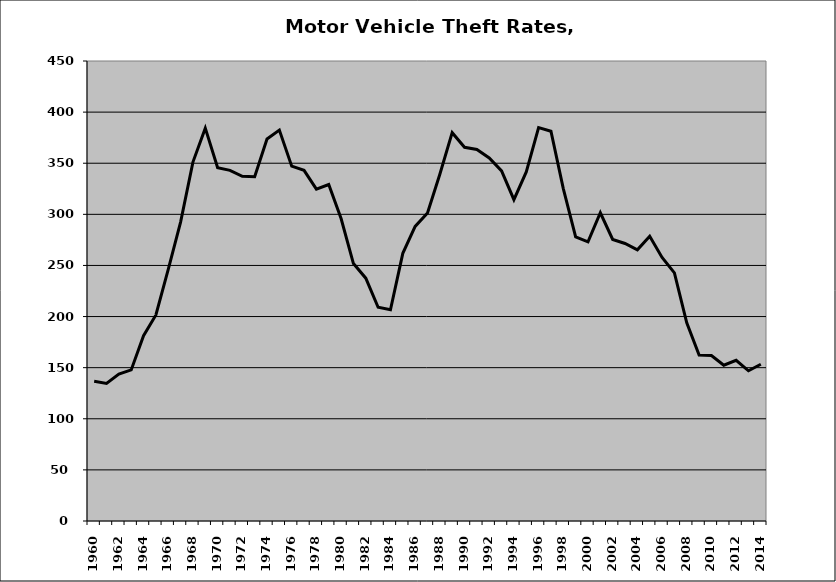
| Category | Motor Vehicle |
|---|---|
| 1960.0 | 136.678 |
| 1961.0 | 134.553 |
| 1962.0 | 143.741 |
| 1963.0 | 147.829 |
| 1964.0 | 181.312 |
| 1965.0 | 201.604 |
| 1966.0 | 246.253 |
| 1967.0 | 292.379 |
| 1968.0 | 351.097 |
| 1969.0 | 384.324 |
| 1970.0 | 345.67 |
| 1971.0 | 343.056 |
| 1972.0 | 337.269 |
| 1973.0 | 336.746 |
| 1974.0 | 373.704 |
| 1975.0 | 382.45 |
| 1976.0 | 347.137 |
| 1977.0 | 343.069 |
| 1978.0 | 324.651 |
| 1979.0 | 329.212 |
| 1980.0 | 295.871 |
| 1981.0 | 251.834 |
| 1982.0 | 237.551 |
| 1983.0 | 209.049 |
| 1984.0 | 206.631 |
| 1985.0 | 261.865 |
| 1986.0 | 288.135 |
| 1987.0 | 301.413 |
| 1988.0 | 339.271 |
| 1989.0 | 379.899 |
| 1990.0 | 365.569 |
| 1991.0 | 363.403 |
| 1992.0 | 355.156 |
| 1993.0 | 342.55 |
| 1994.0 | 314.32 |
| 1995.0 | 341.453 |
| 1996.0 | 384.779 |
| 1997.0 | 381.327 |
| 1998.0 | 325.206 |
| 1999.0 | 277.981 |
| 2000.0 | 273.037 |
| 2001.0 | 301.553 |
| 2002.0 | 275.474 |
| 2003.0 | 271.496 |
| 2004.0 | 265.238 |
| 2005.0 | 278.559 |
| 2006.0 | 257.785 |
| 2007.0 | 242.746 |
| 2008.0 | 193.918 |
| 2009.0 | 162.28 |
| 2010.0 | 161.899 |
| 2011.0 | 152.376 |
| 2012.0 | 157.222 |
| 2013.0 | 146.918 |
| 2014.0 | 153.321 |